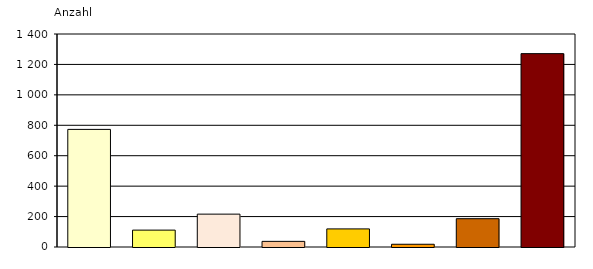
| Category | Series 0 |
|---|---|
| Überforderung der Eltern/eines Elternteil | 773 |
| Schul- und Ausbildungsprobleme | 111 |
| Vernachlässigung | 216 |
| Delinquenz des Kindes/Straftat des Jugendlichen | 37 |
| Anzeichen für Misshandlung | 119 |
| Anzeichen für sexuellen Missbrauch | 18 |
| Beziehungsprobleme | 186 |
| unbegleitete Einreise aus dem Ausland | 1271 |